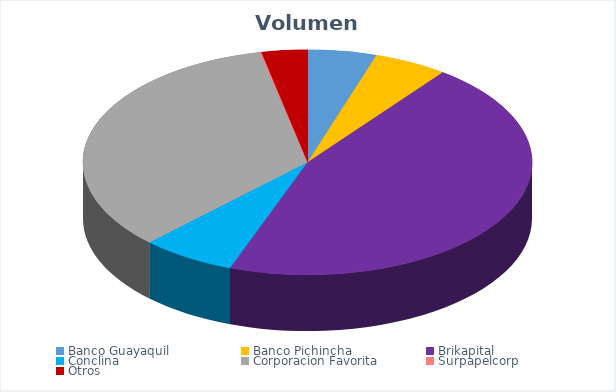
| Category | VOLUMEN ($USD) |
|---|---|
| Banco Guayaquil | 9939.84 |
| Banco Pichincha | 10670 |
| Brikapital | 91000 |
| Conclina | 13639 |
| Corporacion Favorita | 68656.18 |
| Surpapelcorp | 255 |
| Otros | 6600 |